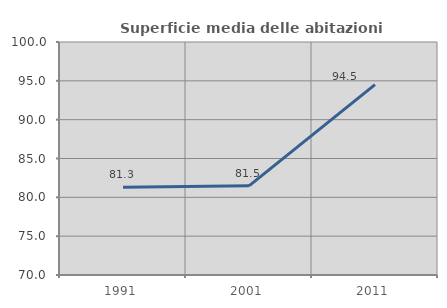
| Category | Superficie media delle abitazioni occupate |
|---|---|
| 1991.0 | 81.303 |
| 2001.0 | 81.482 |
| 2011.0 | 94.502 |